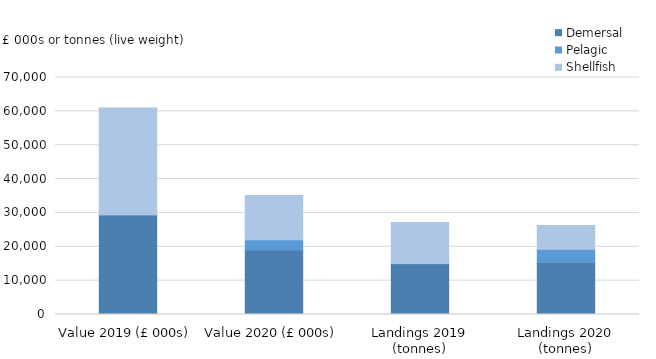
| Category | Demersal | Pelagic | Shellfish |
|---|---|---|---|
| 0 | 29371.407 | 82.702 | 31511.431 |
| 1 | 19033.481 | 3080.492 | 13013.806 |
| 2 | 15013.619 | 58.506 | 12067.648 |
| 3 | 15356.971 | 3904.835 | 7014.518 |